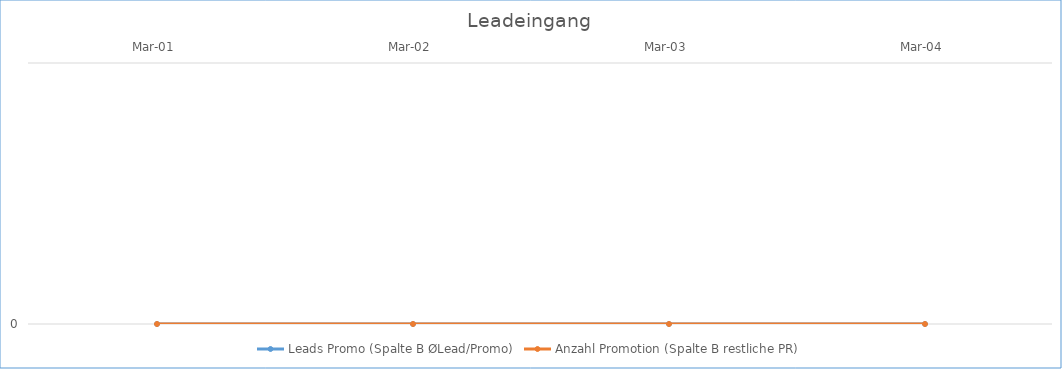
| Category | Leads Promo (Spalte B ØLead/Promo) | Anzahl Promotion (Spalte B restliche PR) |
|---|---|---|
| 2001-03-01 | 0 | 0 |
| 2002-03-01 | 0 | 0 |
| 2003-03-01 | 0 | 0 |
| 2004-03-01 | 0 | 0 |